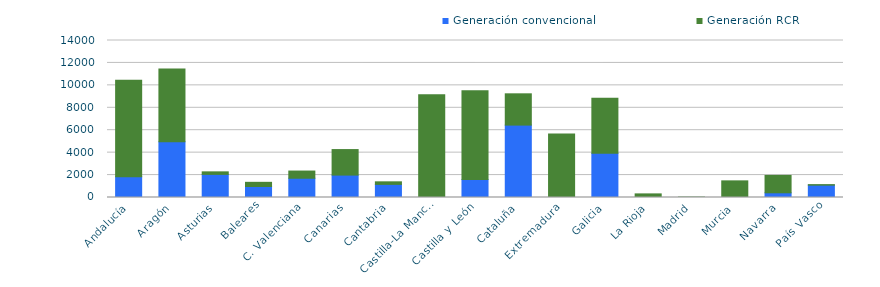
| Category | Generación convencional | Generación RCR |
|---|---|---|
| 0 | 1850.532 | 8605.072 |
| 1 | 4975.035 | 6479.34 |
| 2 | 2060.42 | 226.9 |
| 3 | 980.46 | 373.022 |
| 4 | 1717.3 | 640.75 |
| 5 | 1998.12 | 2276.015 |
| 6 | 1169.42 | 228 |
| 7 | 0 | 9152.474 |
| 8 | 1597 | 7925.805 |
| 9 | 6455.95 | 2789.892 |
| 10 | 0 | 5670.18 |
| 11 | 3943.32 | 4910.77 |
| 12 | 0 | 322.35 |
| 13 | 0 | 38.47 |
| 14 | 0 | 1483.76 |
| 15 | 418.46 | 1550.58 |
| 16 | 1100 | 47 |